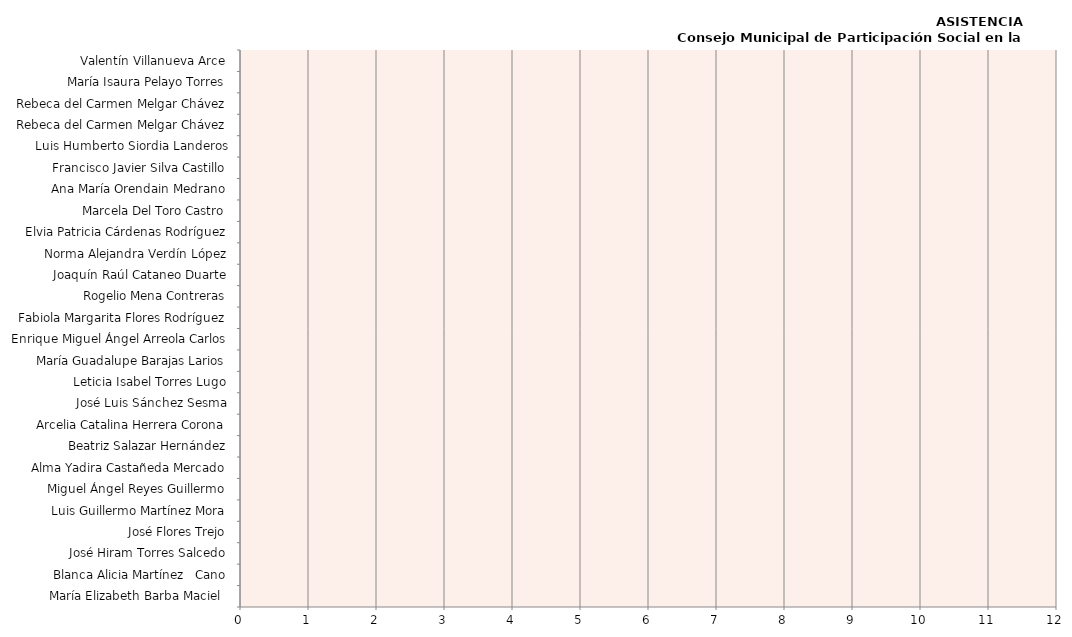
| Category | Series 0 |
|---|---|
| María Elizabeth Barba Maciel  | 0 |
| Blanca Alicia Martínez   Cano | 0 |
| José Hiram Torres Salcedo | 0 |
| José Flores Trejo | 0 |
| Luis Guillermo Martínez Mora | 0 |
| Miguel Ángel Reyes Guillermo | 0 |
| Alma Yadira Castañeda Mercado | 0 |
| Beatriz Salazar Hernández | 0 |
| Arcelia Catalina Herrera Corona | 0 |
| José Luis Sánchez Sesma | 0 |
| Leticia Isabel Torres Lugo | 0 |
| María Guadalupe Barajas Larios | 0 |
| Enrique Miguel Ángel Arreola Carlos | 0 |
| Fabiola Margarita Flores Rodríguez | 0 |
| Rogelio Mena Contreras | 0 |
| Joaquín Raúl Cataneo Duarte | 0 |
| Norma Alejandra Verdín López | 0 |
| Elvia Patricia Cárdenas Rodríguez | 0 |
| Marcela Del Toro Castro | 0 |
| Ana María Orendain Medrano | 0 |
| Francisco Javier Silva Castillo | 0 |
| Luis Humberto Siordia Landeros | 0 |
| Rebeca del Carmen Melgar Chávez | 0 |
| Rebeca del Carmen Melgar Chávez | 0 |
| María Isaura Pelayo Torres | 0 |
| Valentín Villanueva Arce | 0 |